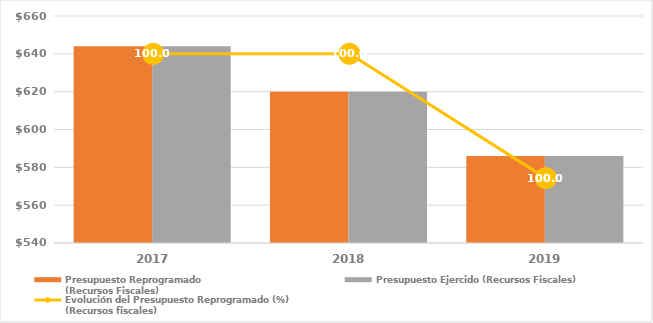
| Category | Presupuesto Reprogramado
(Recursos Fiscales) | Presupuesto Ejercido (Recursos Fiscales) |
|---|---|---|
| 2017.0 | 643942.891 | 643942.891 |
| 2018.0 | 619970.704 | 619970.704 |
| 2019.0 | 585973.956 | 585964.33 |